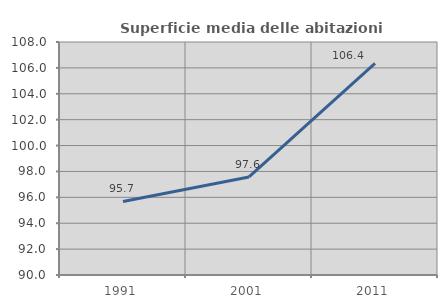
| Category | Superficie media delle abitazioni occupate |
|---|---|
| 1991.0 | 95.679 |
| 2001.0 | 97.574 |
| 2011.0 | 106.356 |